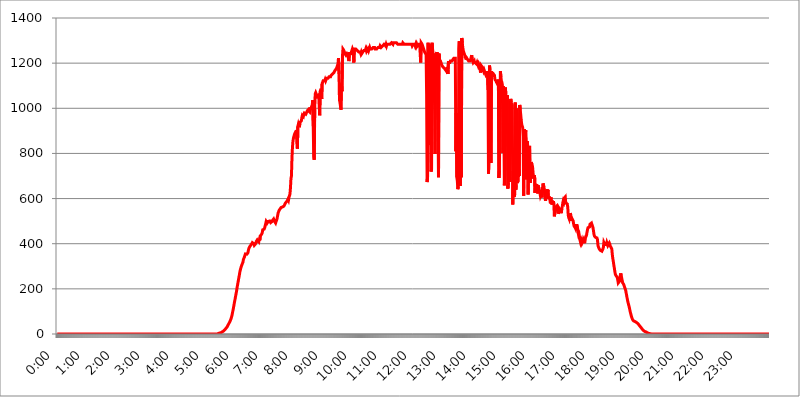
| Category | 2015.04.20. Intenzitás [W/m^2] |
|---|---|
| 0.0 | -0.256 |
| 0.0006944444444444445 | -0.256 |
| 0.001388888888888889 | -0.256 |
| 0.0020833333333333333 | -0.256 |
| 0.002777777777777778 | -0.256 |
| 0.003472222222222222 | -0.256 |
| 0.004166666666666667 | -0.256 |
| 0.004861111111111111 | -0.256 |
| 0.005555555555555556 | -0.256 |
| 0.0062499999999999995 | -0.256 |
| 0.006944444444444444 | -0.256 |
| 0.007638888888888889 | -0.256 |
| 0.008333333333333333 | -0.256 |
| 0.009027777777777779 | -0.256 |
| 0.009722222222222222 | -0.256 |
| 0.010416666666666666 | -0.256 |
| 0.011111111111111112 | -0.256 |
| 0.011805555555555555 | -0.256 |
| 0.012499999999999999 | -0.256 |
| 0.013194444444444444 | -0.256 |
| 0.013888888888888888 | -0.256 |
| 0.014583333333333332 | -0.256 |
| 0.015277777777777777 | -0.256 |
| 0.015972222222222224 | -0.256 |
| 0.016666666666666666 | -0.256 |
| 0.017361111111111112 | -0.256 |
| 0.018055555555555557 | -0.256 |
| 0.01875 | -0.256 |
| 0.019444444444444445 | -0.256 |
| 0.02013888888888889 | -0.256 |
| 0.020833333333333332 | -0.256 |
| 0.02152777777777778 | -0.256 |
| 0.022222222222222223 | -0.256 |
| 0.02291666666666667 | -0.256 |
| 0.02361111111111111 | -0.256 |
| 0.024305555555555556 | -0.256 |
| 0.024999999999999998 | -0.256 |
| 0.025694444444444447 | -0.256 |
| 0.02638888888888889 | -0.256 |
| 0.027083333333333334 | -0.256 |
| 0.027777777777777776 | -0.256 |
| 0.02847222222222222 | -0.256 |
| 0.029166666666666664 | -0.256 |
| 0.029861111111111113 | -0.256 |
| 0.030555555555555555 | -0.256 |
| 0.03125 | -0.256 |
| 0.03194444444444445 | -0.256 |
| 0.03263888888888889 | -0.256 |
| 0.03333333333333333 | -0.256 |
| 0.034027777777777775 | -0.256 |
| 0.034722222222222224 | -0.256 |
| 0.035416666666666666 | -0.256 |
| 0.036111111111111115 | -0.256 |
| 0.03680555555555556 | -0.256 |
| 0.0375 | -0.256 |
| 0.03819444444444444 | -0.256 |
| 0.03888888888888889 | -0.256 |
| 0.03958333333333333 | -0.256 |
| 0.04027777777777778 | -0.256 |
| 0.04097222222222222 | -0.256 |
| 0.041666666666666664 | -0.256 |
| 0.042361111111111106 | -0.256 |
| 0.04305555555555556 | -0.256 |
| 0.043750000000000004 | -0.256 |
| 0.044444444444444446 | -0.256 |
| 0.04513888888888889 | -0.256 |
| 0.04583333333333334 | -0.256 |
| 0.04652777777777778 | -0.256 |
| 0.04722222222222222 | -0.256 |
| 0.04791666666666666 | -0.256 |
| 0.04861111111111111 | -0.256 |
| 0.049305555555555554 | -0.256 |
| 0.049999999999999996 | -0.256 |
| 0.05069444444444445 | -0.256 |
| 0.051388888888888894 | -0.256 |
| 0.052083333333333336 | -0.256 |
| 0.05277777777777778 | -0.256 |
| 0.05347222222222222 | -0.256 |
| 0.05416666666666667 | -0.256 |
| 0.05486111111111111 | -0.256 |
| 0.05555555555555555 | -0.256 |
| 0.05625 | -0.256 |
| 0.05694444444444444 | -0.256 |
| 0.057638888888888885 | -0.256 |
| 0.05833333333333333 | -0.256 |
| 0.05902777777777778 | -0.256 |
| 0.059722222222222225 | -0.256 |
| 0.06041666666666667 | -0.256 |
| 0.061111111111111116 | -0.256 |
| 0.06180555555555556 | -0.256 |
| 0.0625 | -0.256 |
| 0.06319444444444444 | -0.256 |
| 0.06388888888888888 | -0.256 |
| 0.06458333333333334 | -0.256 |
| 0.06527777777777778 | -0.256 |
| 0.06597222222222222 | -0.256 |
| 0.06666666666666667 | -0.256 |
| 0.06736111111111111 | -0.256 |
| 0.06805555555555555 | -0.256 |
| 0.06874999999999999 | -0.256 |
| 0.06944444444444443 | -0.256 |
| 0.07013888888888889 | -0.256 |
| 0.07083333333333333 | -0.256 |
| 0.07152777777777779 | -0.256 |
| 0.07222222222222223 | -0.256 |
| 0.07291666666666667 | -0.256 |
| 0.07361111111111111 | -0.256 |
| 0.07430555555555556 | -0.256 |
| 0.075 | -0.256 |
| 0.07569444444444444 | -0.256 |
| 0.0763888888888889 | -0.256 |
| 0.07708333333333334 | -0.256 |
| 0.07777777777777778 | -0.256 |
| 0.07847222222222222 | -0.256 |
| 0.07916666666666666 | -0.256 |
| 0.0798611111111111 | -0.256 |
| 0.08055555555555556 | -0.256 |
| 0.08125 | -0.256 |
| 0.08194444444444444 | -0.256 |
| 0.08263888888888889 | -0.256 |
| 0.08333333333333333 | -0.256 |
| 0.08402777777777777 | -0.256 |
| 0.08472222222222221 | -0.256 |
| 0.08541666666666665 | -0.256 |
| 0.08611111111111112 | -0.256 |
| 0.08680555555555557 | -0.256 |
| 0.08750000000000001 | -0.256 |
| 0.08819444444444445 | -0.256 |
| 0.08888888888888889 | -0.256 |
| 0.08958333333333333 | -0.256 |
| 0.09027777777777778 | -0.256 |
| 0.09097222222222222 | -0.256 |
| 0.09166666666666667 | -0.256 |
| 0.09236111111111112 | -0.256 |
| 0.09305555555555556 | -0.256 |
| 0.09375 | -0.256 |
| 0.09444444444444444 | -0.256 |
| 0.09513888888888888 | -0.256 |
| 0.09583333333333333 | -0.256 |
| 0.09652777777777777 | -0.256 |
| 0.09722222222222222 | -0.256 |
| 0.09791666666666667 | -0.256 |
| 0.09861111111111111 | -0.256 |
| 0.09930555555555555 | -0.256 |
| 0.09999999999999999 | -0.256 |
| 0.10069444444444443 | -0.256 |
| 0.1013888888888889 | -0.256 |
| 0.10208333333333335 | -0.256 |
| 0.10277777777777779 | -0.256 |
| 0.10347222222222223 | -0.256 |
| 0.10416666666666667 | -0.256 |
| 0.10486111111111111 | -0.256 |
| 0.10555555555555556 | -0.256 |
| 0.10625 | -0.256 |
| 0.10694444444444444 | -0.256 |
| 0.1076388888888889 | -0.256 |
| 0.10833333333333334 | -0.256 |
| 0.10902777777777778 | -0.256 |
| 0.10972222222222222 | -0.256 |
| 0.1111111111111111 | -0.256 |
| 0.11180555555555556 | -0.256 |
| 0.11180555555555556 | -0.256 |
| 0.1125 | -0.256 |
| 0.11319444444444444 | -0.256 |
| 0.11388888888888889 | -0.256 |
| 0.11458333333333333 | -0.256 |
| 0.11527777777777777 | -0.256 |
| 0.11597222222222221 | -0.256 |
| 0.11666666666666665 | -0.256 |
| 0.1173611111111111 | -0.256 |
| 0.11805555555555557 | -0.256 |
| 0.11944444444444445 | -0.256 |
| 0.12013888888888889 | -0.256 |
| 0.12083333333333333 | -0.256 |
| 0.12152777777777778 | -0.256 |
| 0.12222222222222223 | -0.256 |
| 0.12291666666666667 | -0.256 |
| 0.12291666666666667 | -0.256 |
| 0.12361111111111112 | -0.256 |
| 0.12430555555555556 | -0.256 |
| 0.125 | -0.256 |
| 0.12569444444444444 | -0.256 |
| 0.12638888888888888 | -0.256 |
| 0.12708333333333333 | -0.256 |
| 0.16875 | -0.256 |
| 0.12847222222222224 | -0.256 |
| 0.12916666666666668 | -0.256 |
| 0.12986111111111112 | -0.256 |
| 0.13055555555555556 | -0.256 |
| 0.13125 | -0.256 |
| 0.13194444444444445 | -0.256 |
| 0.1326388888888889 | -0.256 |
| 0.13333333333333333 | -0.256 |
| 0.13402777777777777 | -0.256 |
| 0.13402777777777777 | -0.256 |
| 0.13472222222222222 | -0.256 |
| 0.13541666666666666 | -0.256 |
| 0.1361111111111111 | -0.256 |
| 0.13749999999999998 | -0.256 |
| 0.13819444444444443 | -0.256 |
| 0.1388888888888889 | -0.256 |
| 0.13958333333333334 | -0.256 |
| 0.14027777777777778 | -0.256 |
| 0.14097222222222222 | -0.256 |
| 0.14166666666666666 | -0.256 |
| 0.1423611111111111 | -0.256 |
| 0.14305555555555557 | -0.256 |
| 0.14375000000000002 | -0.256 |
| 0.14444444444444446 | -0.256 |
| 0.1451388888888889 | -0.256 |
| 0.1451388888888889 | -0.256 |
| 0.14652777777777778 | -0.256 |
| 0.14722222222222223 | -0.256 |
| 0.14791666666666667 | -0.256 |
| 0.1486111111111111 | -0.256 |
| 0.14930555555555555 | -0.256 |
| 0.15 | -0.256 |
| 0.15069444444444444 | -0.256 |
| 0.15138888888888888 | -0.256 |
| 0.15208333333333332 | -0.256 |
| 0.15277777777777776 | -0.256 |
| 0.15347222222222223 | -0.256 |
| 0.15416666666666667 | -0.256 |
| 0.15486111111111112 | -0.256 |
| 0.15555555555555556 | -0.256 |
| 0.15625 | -0.256 |
| 0.15694444444444444 | -0.256 |
| 0.15763888888888888 | -0.256 |
| 0.15833333333333333 | -0.256 |
| 0.15902777777777777 | -0.256 |
| 0.15972222222222224 | -0.256 |
| 0.16041666666666668 | -0.256 |
| 0.16111111111111112 | -0.256 |
| 0.16180555555555556 | -0.256 |
| 0.1625 | -0.256 |
| 0.16319444444444445 | -0.256 |
| 0.1638888888888889 | -0.256 |
| 0.16458333333333333 | -0.256 |
| 0.16527777777777777 | -0.256 |
| 0.16597222222222222 | -0.256 |
| 0.16666666666666666 | -0.256 |
| 0.1673611111111111 | -0.256 |
| 0.16805555555555554 | -0.256 |
| 0.16874999999999998 | -0.256 |
| 0.16944444444444443 | -0.256 |
| 0.17013888888888887 | -0.256 |
| 0.1708333333333333 | -0.256 |
| 0.17152777777777775 | -0.256 |
| 0.17222222222222225 | -0.256 |
| 0.1729166666666667 | -0.256 |
| 0.17361111111111113 | -0.256 |
| 0.17430555555555557 | -0.256 |
| 0.17500000000000002 | -0.256 |
| 0.17569444444444446 | -0.256 |
| 0.1763888888888889 | -0.256 |
| 0.17708333333333334 | -0.256 |
| 0.17777777777777778 | -0.256 |
| 0.17847222222222223 | -0.256 |
| 0.17916666666666667 | -0.256 |
| 0.1798611111111111 | -0.256 |
| 0.18055555555555555 | -0.256 |
| 0.18125 | -0.256 |
| 0.18194444444444444 | -0.256 |
| 0.1826388888888889 | -0.256 |
| 0.18333333333333335 | -0.256 |
| 0.1840277777777778 | -0.256 |
| 0.18472222222222223 | -0.256 |
| 0.18541666666666667 | -0.256 |
| 0.18611111111111112 | -0.256 |
| 0.18680555555555556 | -0.256 |
| 0.1875 | -0.256 |
| 0.18819444444444444 | -0.256 |
| 0.18888888888888888 | -0.256 |
| 0.18958333333333333 | -0.256 |
| 0.19027777777777777 | -0.256 |
| 0.1909722222222222 | -0.256 |
| 0.19166666666666665 | -0.256 |
| 0.19236111111111112 | -0.256 |
| 0.19305555555555554 | -0.256 |
| 0.19375 | -0.256 |
| 0.19444444444444445 | -0.256 |
| 0.1951388888888889 | -0.256 |
| 0.19583333333333333 | -0.256 |
| 0.19652777777777777 | -0.256 |
| 0.19722222222222222 | -0.256 |
| 0.19791666666666666 | -0.256 |
| 0.1986111111111111 | -0.256 |
| 0.19930555555555554 | -0.256 |
| 0.19999999999999998 | -0.256 |
| 0.20069444444444443 | -0.256 |
| 0.20138888888888887 | -0.256 |
| 0.2020833333333333 | -0.256 |
| 0.2027777777777778 | -0.256 |
| 0.2034722222222222 | -0.256 |
| 0.2041666666666667 | -0.256 |
| 0.20486111111111113 | -0.256 |
| 0.20555555555555557 | -0.256 |
| 0.20625000000000002 | -0.256 |
| 0.20694444444444446 | -0.256 |
| 0.2076388888888889 | -0.256 |
| 0.20833333333333334 | -0.256 |
| 0.20902777777777778 | -0.256 |
| 0.20972222222222223 | -0.256 |
| 0.21041666666666667 | -0.256 |
| 0.2111111111111111 | -0.256 |
| 0.21180555555555555 | -0.256 |
| 0.2125 | -0.256 |
| 0.21319444444444444 | -0.256 |
| 0.2138888888888889 | -0.256 |
| 0.21458333333333335 | -0.256 |
| 0.2152777777777778 | -0.256 |
| 0.21597222222222223 | -0.256 |
| 0.21666666666666667 | -0.256 |
| 0.21736111111111112 | -0.256 |
| 0.21805555555555556 | -0.256 |
| 0.21875 | -0.256 |
| 0.21944444444444444 | -0.256 |
| 0.22013888888888888 | -0.256 |
| 0.22083333333333333 | -0.256 |
| 0.22152777777777777 | -0.256 |
| 0.2222222222222222 | -0.256 |
| 0.22291666666666665 | -0.256 |
| 0.2236111111111111 | 1.09 |
| 0.22430555555555556 | 1.09 |
| 0.225 | 1.09 |
| 0.22569444444444445 | 2.439 |
| 0.2263888888888889 | 2.439 |
| 0.22708333333333333 | 3.791 |
| 0.22777777777777777 | 3.791 |
| 0.22847222222222222 | 5.146 |
| 0.22916666666666666 | 5.146 |
| 0.2298611111111111 | 6.503 |
| 0.23055555555555554 | 7.862 |
| 0.23124999999999998 | 9.225 |
| 0.23194444444444443 | 10.589 |
| 0.23263888888888887 | 11.956 |
| 0.2333333333333333 | 13.325 |
| 0.2340277777777778 | 16.069 |
| 0.2347222222222222 | 17.444 |
| 0.2354166666666667 | 20.201 |
| 0.23611111111111113 | 22.965 |
| 0.23680555555555557 | 25.736 |
| 0.23750000000000002 | 28.514 |
| 0.23819444444444446 | 31.297 |
| 0.2388888888888889 | 35.483 |
| 0.23958333333333334 | 39.68 |
| 0.24027777777777778 | 43.886 |
| 0.24097222222222223 | 48.1 |
| 0.24166666666666667 | 52.322 |
| 0.2423611111111111 | 56.548 |
| 0.24305555555555555 | 62.189 |
| 0.24375 | 67.835 |
| 0.24444444444444446 | 74.892 |
| 0.24513888888888888 | 83.356 |
| 0.24583333333333335 | 94.617 |
| 0.2465277777777778 | 105.834 |
| 0.24722222222222223 | 116.989 |
| 0.24791666666666667 | 129.444 |
| 0.24861111111111112 | 141.782 |
| 0.24930555555555556 | 152.637 |
| 0.25 | 164.712 |
| 0.25069444444444444 | 176.631 |
| 0.2513888888888889 | 188.389 |
| 0.2520833333333333 | 202.534 |
| 0.25277777777777777 | 215.177 |
| 0.2534722222222222 | 227.618 |
| 0.25416666666666665 | 239.868 |
| 0.2548611111111111 | 251.939 |
| 0.2555555555555556 | 263.851 |
| 0.25625000000000003 | 276.797 |
| 0.2569444444444445 | 286.13 |
| 0.2576388888888889 | 294.255 |
| 0.25833333333333336 | 301.198 |
| 0.2590277777777778 | 306.974 |
| 0.25972222222222224 | 312.749 |
| 0.2604166666666667 | 317.371 |
| 0.2611111111111111 | 330.117 |
| 0.26180555555555557 | 335.941 |
| 0.2625 | 340.62 |
| 0.26319444444444445 | 348.865 |
| 0.2638888888888889 | 354.805 |
| 0.26458333333333334 | 355.999 |
| 0.2652777777777778 | 357.196 |
| 0.2659722222222222 | 353.613 |
| 0.26666666666666666 | 351.235 |
| 0.2673611111111111 | 359.595 |
| 0.26805555555555555 | 370.515 |
| 0.26875 | 379.171 |
| 0.26944444444444443 | 382.93 |
| 0.2701388888888889 | 387.995 |
| 0.2708333333333333 | 391.834 |
| 0.27152777777777776 | 390.55 |
| 0.2722222222222222 | 397.012 |
| 0.27291666666666664 | 400.943 |
| 0.2736111111111111 | 404.916 |
| 0.2743055555555555 | 407.589 |
| 0.27499999999999997 | 406.25 |
| 0.27569444444444446 | 399.628 |
| 0.27638888888888885 | 393.122 |
| 0.27708333333333335 | 391.834 |
| 0.2777777777777778 | 397.012 |
| 0.27847222222222223 | 400.943 |
| 0.2791666666666667 | 410.283 |
| 0.2798611111111111 | 411.638 |
| 0.28055555555555556 | 417.112 |
| 0.28125 | 418.495 |
| 0.28194444444444444 | 418.495 |
| 0.2826388888888889 | 408.934 |
| 0.2833333333333333 | 422.678 |
| 0.28402777777777777 | 414.364 |
| 0.2847222222222222 | 434.107 |
| 0.28541666666666665 | 435.566 |
| 0.28611111111111115 | 435.566 |
| 0.28680555555555554 | 442.962 |
| 0.28750000000000003 | 449.011 |
| 0.2881944444444445 | 461.486 |
| 0.2888888888888889 | 463.083 |
| 0.28958333333333336 | 463.083 |
| 0.2902777777777778 | 464.688 |
| 0.29097222222222224 | 471.198 |
| 0.2916666666666667 | 479.541 |
| 0.2923611111111111 | 482.945 |
| 0.29305555555555557 | 498.764 |
| 0.29375 | 502.396 |
| 0.29444444444444445 | 491.63 |
| 0.2951388888888889 | 489.873 |
| 0.29583333333333334 | 498.764 |
| 0.2965277777777778 | 496.965 |
| 0.2972222222222222 | 500.575 |
| 0.29791666666666666 | 500.575 |
| 0.2986111111111111 | 498.764 |
| 0.29930555555555555 | 493.398 |
| 0.3 | 495.176 |
| 0.30069444444444443 | 491.63 |
| 0.3013888888888889 | 498.764 |
| 0.3020833333333333 | 504.229 |
| 0.30277777777777776 | 504.229 |
| 0.3034722222222222 | 509.793 |
| 0.30416666666666664 | 506.072 |
| 0.3048611111111111 | 498.764 |
| 0.3055555555555555 | 496.965 |
| 0.30624999999999997 | 491.63 |
| 0.3069444444444444 | 498.764 |
| 0.3076388888888889 | 504.229 |
| 0.30833333333333335 | 511.671 |
| 0.3090277777777778 | 523.186 |
| 0.30972222222222223 | 535.145 |
| 0.3104166666666667 | 539.234 |
| 0.3111111111111111 | 547.572 |
| 0.31180555555555556 | 549.691 |
| 0.3125 | 553.97 |
| 0.31319444444444444 | 558.305 |
| 0.3138888888888889 | 560.495 |
| 0.3145833333333333 | 562.699 |
| 0.31527777777777777 | 560.495 |
| 0.3159722222222222 | 562.699 |
| 0.31666666666666665 | 564.917 |
| 0.31736111111111115 | 564.917 |
| 0.31805555555555554 | 567.15 |
| 0.31875000000000003 | 571.661 |
| 0.3194444444444445 | 576.233 |
| 0.3201388888888889 | 580.866 |
| 0.32083333333333336 | 583.206 |
| 0.3215277777777778 | 585.562 |
| 0.32222222222222224 | 587.934 |
| 0.3229166666666667 | 592.725 |
| 0.3236111111111111 | 597.582 |
| 0.32430555555555557 | 592.725 |
| 0.325 | 604.992 |
| 0.32569444444444445 | 612.554 |
| 0.3263888888888889 | 620.273 |
| 0.32708333333333334 | 647.179 |
| 0.3277777777777778 | 688.102 |
| 0.3284722222222222 | 700.54 |
| 0.32916666666666666 | 775.451 |
| 0.3298611111111111 | 825.351 |
| 0.33055555555555555 | 854.113 |
| 0.33125 | 866.865 |
| 0.33194444444444443 | 875.511 |
| 0.3326388888888889 | 884.274 |
| 0.3333333333333333 | 888.701 |
| 0.3340277777777778 | 893.157 |
| 0.3347222222222222 | 897.643 |
| 0.3354166666666667 | 902.16 |
| 0.3361111111111111 | 902.16 |
| 0.3368055555555556 | 821.353 |
| 0.33749999999999997 | 920.533 |
| 0.33819444444444446 | 929.905 |
| 0.33888888888888885 | 929.905 |
| 0.33958333333333335 | 915.893 |
| 0.34027777777777773 | 934.639 |
| 0.34097222222222223 | 939.404 |
| 0.3416666666666666 | 939.404 |
| 0.3423611111111111 | 944.201 |
| 0.3430555555555555 | 958.785 |
| 0.34375 | 968.671 |
| 0.3444444444444445 | 968.671 |
| 0.3451388888888889 | 963.712 |
| 0.3458333333333334 | 973.663 |
| 0.34652777777777777 | 978.688 |
| 0.34722222222222227 | 978.688 |
| 0.34791666666666665 | 978.688 |
| 0.34861111111111115 | 973.663 |
| 0.34930555555555554 | 978.688 |
| 0.35000000000000003 | 983.747 |
| 0.3506944444444444 | 988.839 |
| 0.3513888888888889 | 988.839 |
| 0.3520833333333333 | 993.965 |
| 0.3527777777777778 | 988.839 |
| 0.3534722222222222 | 988.839 |
| 0.3541666666666667 | 983.747 |
| 0.3548611111111111 | 993.965 |
| 0.35555555555555557 | 1004.318 |
| 0.35625 | 993.965 |
| 0.35694444444444445 | 1009.546 |
| 0.3576388888888889 | 1014.809 |
| 0.35833333333333334 | 1036.206 |
| 0.3590277777777778 | 920.533 |
| 0.3597222222222222 | 786.575 |
| 0.36041666666666666 | 771.794 |
| 0.3611111111111111 | 999.125 |
| 0.36180555555555555 | 1063.751 |
| 0.3625 | 1069.368 |
| 0.36319444444444443 | 1063.751 |
| 0.3638888888888889 | 1058.17 |
| 0.3645833333333333 | 1052.625 |
| 0.3652777777777778 | 1052.625 |
| 0.3659722222222222 | 1052.625 |
| 0.3666666666666667 | 1058.17 |
| 0.3673611111111111 | 1058.17 |
| 0.3680555555555556 | 968.671 |
| 0.36874999999999997 | 1075.021 |
| 0.36944444444444446 | 1080.711 |
| 0.37013888888888885 | 1086.439 |
| 0.37083333333333335 | 1041.644 |
| 0.37152777777777773 | 1109.72 |
| 0.37222222222222223 | 1115.634 |
| 0.3729166666666666 | 1121.587 |
| 0.3736111111111111 | 1121.587 |
| 0.3743055555555555 | 1121.587 |
| 0.375 | 1121.587 |
| 0.3756944444444445 | 1127.578 |
| 0.3763888888888889 | 1121.587 |
| 0.3770833333333334 | 1121.587 |
| 0.37777777777777777 | 1133.607 |
| 0.37847222222222227 | 1133.607 |
| 0.37916666666666665 | 1133.607 |
| 0.37986111111111115 | 1133.607 |
| 0.38055555555555554 | 1133.607 |
| 0.38125000000000003 | 1139.675 |
| 0.3819444444444444 | 1139.675 |
| 0.3826388888888889 | 1139.675 |
| 0.3833333333333333 | 1139.675 |
| 0.3840277777777778 | 1145.782 |
| 0.3847222222222222 | 1145.782 |
| 0.3854166666666667 | 1145.782 |
| 0.3861111111111111 | 1151.928 |
| 0.38680555555555557 | 1151.928 |
| 0.3875 | 1151.928 |
| 0.38819444444444445 | 1158.113 |
| 0.3888888888888889 | 1164.337 |
| 0.38958333333333334 | 1164.337 |
| 0.3902777777777778 | 1170.601 |
| 0.3909722222222222 | 1170.601 |
| 0.39166666666666666 | 1176.905 |
| 0.3923611111111111 | 1176.905 |
| 0.39305555555555555 | 1189.633 |
| 0.39375 | 1196.058 |
| 0.39444444444444443 | 1222.164 |
| 0.3951388888888889 | 1151.928 |
| 0.3958333333333333 | 1036.206 |
| 0.3965277777777778 | 1025.437 |
| 0.3972222222222222 | 1009.546 |
| 0.3979166666666667 | 993.965 |
| 0.3986111111111111 | 1109.72 |
| 0.3993055555555556 | 1075.021 |
| 0.39999999999999997 | 1228.794 |
| 0.40069444444444446 | 1262.571 |
| 0.40138888888888885 | 1262.571 |
| 0.40208333333333335 | 1255.731 |
| 0.40277777777777773 | 1248.934 |
| 0.40347222222222223 | 1242.179 |
| 0.4041666666666666 | 1242.179 |
| 0.4048611111111111 | 1235.465 |
| 0.4055555555555555 | 1235.465 |
| 0.40625 | 1242.179 |
| 0.4069444444444445 | 1242.179 |
| 0.4076388888888889 | 1235.465 |
| 0.4083333333333334 | 1235.465 |
| 0.40902777777777777 | 1209.029 |
| 0.40972222222222227 | 1242.179 |
| 0.41041666666666665 | 1242.179 |
| 0.41111111111111115 | 1242.179 |
| 0.41180555555555554 | 1242.179 |
| 0.41250000000000003 | 1248.934 |
| 0.4131944444444444 | 1248.934 |
| 0.4138888888888889 | 1262.571 |
| 0.4145833333333333 | 1255.731 |
| 0.4152777777777778 | 1235.465 |
| 0.4159722222222222 | 1202.523 |
| 0.4166666666666667 | 1262.571 |
| 0.4173611111111111 | 1262.571 |
| 0.41805555555555557 | 1262.571 |
| 0.41875 | 1262.571 |
| 0.41944444444444445 | 1262.571 |
| 0.4201388888888889 | 1262.571 |
| 0.42083333333333334 | 1255.731 |
| 0.4215277777777778 | 1255.731 |
| 0.4222222222222222 | 1255.731 |
| 0.42291666666666666 | 1248.934 |
| 0.4236111111111111 | 1248.934 |
| 0.42430555555555555 | 1248.934 |
| 0.425 | 1248.934 |
| 0.42569444444444443 | 1242.179 |
| 0.4263888888888889 | 1248.934 |
| 0.4270833333333333 | 1242.179 |
| 0.4277777777777778 | 1242.179 |
| 0.4284722222222222 | 1248.934 |
| 0.4291666666666667 | 1248.934 |
| 0.4298611111111111 | 1255.731 |
| 0.4305555555555556 | 1255.731 |
| 0.43124999999999997 | 1255.731 |
| 0.43194444444444446 | 1255.731 |
| 0.43263888888888885 | 1262.571 |
| 0.43333333333333335 | 1255.731 |
| 0.43402777777777773 | 1262.571 |
| 0.43472222222222223 | 1255.731 |
| 0.4354166666666666 | 1255.731 |
| 0.4361111111111111 | 1262.571 |
| 0.4368055555555555 | 1255.731 |
| 0.4375 | 1262.571 |
| 0.4381944444444445 | 1269.454 |
| 0.4388888888888889 | 1262.571 |
| 0.4395833333333334 | 1262.571 |
| 0.44027777777777777 | 1262.571 |
| 0.44097222222222227 | 1262.571 |
| 0.44166666666666665 | 1262.571 |
| 0.44236111111111115 | 1262.571 |
| 0.44305555555555554 | 1269.454 |
| 0.44375000000000003 | 1269.454 |
| 0.4444444444444444 | 1269.454 |
| 0.4451388888888889 | 1269.454 |
| 0.4458333333333333 | 1262.571 |
| 0.4465277777777778 | 1262.571 |
| 0.4472222222222222 | 1262.571 |
| 0.4479166666666667 | 1262.571 |
| 0.4486111111111111 | 1262.571 |
| 0.44930555555555557 | 1262.571 |
| 0.45 | 1269.454 |
| 0.45069444444444445 | 1269.454 |
| 0.4513888888888889 | 1269.454 |
| 0.45208333333333334 | 1269.454 |
| 0.4527777777777778 | 1276.38 |
| 0.4534722222222222 | 1276.38 |
| 0.45416666666666666 | 1269.454 |
| 0.4548611111111111 | 1269.454 |
| 0.45555555555555555 | 1269.454 |
| 0.45625 | 1276.38 |
| 0.45694444444444443 | 1276.38 |
| 0.4576388888888889 | 1276.38 |
| 0.4583333333333333 | 1283.348 |
| 0.4590277777777778 | 1283.348 |
| 0.4597222222222222 | 1283.348 |
| 0.4604166666666667 | 1276.38 |
| 0.4611111111111111 | 1283.348 |
| 0.4618055555555556 | 1276.38 |
| 0.46249999999999997 | 1283.348 |
| 0.46319444444444446 | 1283.348 |
| 0.46388888888888885 | 1283.348 |
| 0.46458333333333335 | 1283.348 |
| 0.46527777777777773 | 1283.348 |
| 0.46597222222222223 | 1283.348 |
| 0.4666666666666666 | 1283.348 |
| 0.4673611111111111 | 1283.348 |
| 0.4680555555555555 | 1283.348 |
| 0.46875 | 1290.36 |
| 0.4694444444444445 | 1290.36 |
| 0.4701388888888889 | 1290.36 |
| 0.4708333333333334 | 1283.348 |
| 0.47152777777777777 | 1290.36 |
| 0.47222222222222227 | 1290.36 |
| 0.47291666666666665 | 1290.36 |
| 0.47361111111111115 | 1290.36 |
| 0.47430555555555554 | 1290.36 |
| 0.47500000000000003 | 1290.36 |
| 0.4756944444444444 | 1290.36 |
| 0.4763888888888889 | 1290.36 |
| 0.4770833333333333 | 1290.36 |
| 0.4777777777777778 | 1283.348 |
| 0.4784722222222222 | 1283.348 |
| 0.4791666666666667 | 1283.348 |
| 0.4798611111111111 | 1283.348 |
| 0.48055555555555557 | 1283.348 |
| 0.48125 | 1283.348 |
| 0.48194444444444445 | 1283.348 |
| 0.4826388888888889 | 1283.348 |
| 0.48333333333333334 | 1283.348 |
| 0.4840277777777778 | 1283.348 |
| 0.4847222222222222 | 1290.36 |
| 0.48541666666666666 | 1290.36 |
| 0.4861111111111111 | 1290.36 |
| 0.48680555555555555 | 1283.348 |
| 0.4875 | 1283.348 |
| 0.48819444444444443 | 1283.348 |
| 0.4888888888888889 | 1283.348 |
| 0.4895833333333333 | 1283.348 |
| 0.4902777777777778 | 1283.348 |
| 0.4909722222222222 | 1283.348 |
| 0.4916666666666667 | 1283.348 |
| 0.4923611111111111 | 1283.348 |
| 0.4930555555555556 | 1283.348 |
| 0.49374999999999997 | 1283.348 |
| 0.49444444444444446 | 1283.348 |
| 0.49513888888888885 | 1283.348 |
| 0.49583333333333335 | 1283.348 |
| 0.49652777777777773 | 1283.348 |
| 0.49722222222222223 | 1283.348 |
| 0.4979166666666666 | 1276.38 |
| 0.4986111111111111 | 1276.38 |
| 0.4993055555555555 | 1283.348 |
| 0.5 | 1283.348 |
| 0.5006944444444444 | 1283.348 |
| 0.5013888888888889 | 1283.348 |
| 0.5020833333333333 | 1276.38 |
| 0.5027777777777778 | 1283.348 |
| 0.5034722222222222 | 1276.38 |
| 0.5041666666666667 | 1283.348 |
| 0.5048611111111111 | 1276.38 |
| 0.5055555555555555 | 1276.38 |
| 0.50625 | 1283.348 |
| 0.5069444444444444 | 1283.348 |
| 0.5076388888888889 | 1283.348 |
| 0.5083333333333333 | 1283.348 |
| 0.5090277777777777 | 1283.348 |
| 0.5097222222222222 | 1202.523 |
| 0.5104166666666666 | 1290.36 |
| 0.5111111111111112 | 1290.36 |
| 0.5118055555555555 | 1283.348 |
| 0.5125000000000001 | 1276.38 |
| 0.5131944444444444 | 1269.454 |
| 0.513888888888889 | 1262.571 |
| 0.5145833333333333 | 1255.731 |
| 0.5152777777777778 | 1248.934 |
| 0.5159722222222222 | 1248.934 |
| 0.5166666666666667 | 1242.179 |
| 0.517361111111111 | 1235.465 |
| 0.5180555555555556 | 1063.751 |
| 0.5187499999999999 | 673.03 |
| 0.5194444444444445 | 697.399 |
| 0.5201388888888888 | 1290.36 |
| 0.5208333333333334 | 837.51 |
| 0.5215277777777778 | 1283.348 |
| 0.5222222222222223 | 1262.571 |
| 0.5229166666666667 | 1248.934 |
| 0.5236111111111111 | 1276.38 |
| 0.5243055555555556 | 719.855 |
| 0.525 | 729.817 |
| 0.5256944444444445 | 1290.36 |
| 0.5263888888888889 | 1262.571 |
| 0.5270833333333333 | 1242.179 |
| 0.5277777777777778 | 1235.465 |
| 0.5284722222222222 | 1228.794 |
| 0.5291666666666667 | 1014.809 |
| 0.5298611111111111 | 797.931 |
| 0.5305555555555556 | 1242.179 |
| 0.53125 | 1228.794 |
| 0.5319444444444444 | 1228.794 |
| 0.5326388888888889 | 1248.934 |
| 0.5333333333333333 | 1248.934 |
| 0.5340277777777778 | 949.03 |
| 0.5347222222222222 | 694.278 |
| 0.5354166666666667 | 1242.179 |
| 0.5361111111111111 | 1215.576 |
| 0.5368055555555555 | 1215.576 |
| 0.5375 | 1209.029 |
| 0.5381944444444444 | 1202.523 |
| 0.5388888888888889 | 1196.058 |
| 0.5395833333333333 | 1189.633 |
| 0.5402777777777777 | 1189.633 |
| 0.5409722222222222 | 1183.249 |
| 0.5416666666666666 | 1183.249 |
| 0.5423611111111112 | 1183.249 |
| 0.5430555555555555 | 1176.905 |
| 0.5437500000000001 | 1176.905 |
| 0.5444444444444444 | 1170.601 |
| 0.545138888888889 | 1170.601 |
| 0.5458333333333333 | 1164.337 |
| 0.5465277777777778 | 1170.601 |
| 0.5472222222222222 | 1183.249 |
| 0.5479166666666667 | 1151.928 |
| 0.548611111111111 | 1202.523 |
| 0.5493055555555556 | 1202.523 |
| 0.5499999999999999 | 1202.523 |
| 0.5506944444444445 | 1202.523 |
| 0.5513888888888888 | 1209.029 |
| 0.5520833333333334 | 1209.029 |
| 0.5527777777777778 | 1209.029 |
| 0.5534722222222223 | 1209.029 |
| 0.5541666666666667 | 1209.029 |
| 0.5548611111111111 | 1215.576 |
| 0.5555555555555556 | 1215.576 |
| 0.55625 | 1222.164 |
| 0.5569444444444445 | 1222.164 |
| 0.5576388888888889 | 1222.164 |
| 0.5583333333333333 | 1222.164 |
| 0.5590277777777778 | 809.522 |
| 0.5597222222222222 | 978.688 |
| 0.5604166666666667 | 694.278 |
| 0.5611111111111111 | 678.997 |
| 0.5618055555555556 | 641.649 |
| 0.5625 | 652.786 |
| 0.5631944444444444 | 1262.571 |
| 0.5638888888888889 | 1297.416 |
| 0.5645833333333333 | 743.425 |
| 0.5652777777777778 | 655.618 |
| 0.5659722222222222 | 794.119 |
| 0.5666666666666667 | 694.278 |
| 0.5673611111111111 | 1311.658 |
| 0.5680555555555555 | 1290.36 |
| 0.56875 | 1269.454 |
| 0.5694444444444444 | 1255.731 |
| 0.5701388888888889 | 1248.934 |
| 0.5708333333333333 | 1242.179 |
| 0.5715277777777777 | 1235.465 |
| 0.5722222222222222 | 1222.164 |
| 0.5729166666666666 | 1228.794 |
| 0.5736111111111112 | 1215.576 |
| 0.5743055555555555 | 1222.164 |
| 0.5750000000000001 | 1222.164 |
| 0.5756944444444444 | 1215.576 |
| 0.576388888888889 | 1215.576 |
| 0.5770833333333333 | 1209.029 |
| 0.5777777777777778 | 1209.029 |
| 0.5784722222222222 | 1209.029 |
| 0.5791666666666667 | 1209.029 |
| 0.579861111111111 | 1209.029 |
| 0.5805555555555556 | 1209.029 |
| 0.5812499999999999 | 1235.465 |
| 0.5819444444444445 | 1215.576 |
| 0.5826388888888888 | 1209.029 |
| 0.5833333333333334 | 1202.523 |
| 0.5840277777777778 | 1202.523 |
| 0.5847222222222223 | 1209.029 |
| 0.5854166666666667 | 1196.058 |
| 0.5861111111111111 | 1202.523 |
| 0.5868055555555556 | 1202.523 |
| 0.5875 | 1202.523 |
| 0.5881944444444445 | 1196.058 |
| 0.5888888888888889 | 1202.523 |
| 0.5895833333333333 | 1196.058 |
| 0.5902777777777778 | 1189.633 |
| 0.5909722222222222 | 1196.058 |
| 0.5916666666666667 | 1189.633 |
| 0.5923611111111111 | 1189.633 |
| 0.5930555555555556 | 1170.601 |
| 0.59375 | 1158.113 |
| 0.5944444444444444 | 1189.633 |
| 0.5951388888888889 | 1189.633 |
| 0.5958333333333333 | 1183.249 |
| 0.5965277777777778 | 1176.905 |
| 0.5972222222222222 | 1170.601 |
| 0.5979166666666667 | 1164.337 |
| 0.5986111111111111 | 1170.601 |
| 0.5993055555555555 | 1164.337 |
| 0.6 | 1164.337 |
| 0.6006944444444444 | 1151.928 |
| 0.6013888888888889 | 1158.113 |
| 0.6020833333333333 | 1164.337 |
| 0.6027777777777777 | 1151.928 |
| 0.6034722222222222 | 1158.113 |
| 0.6041666666666666 | 1080.711 |
| 0.6048611111111112 | 710.098 |
| 0.6055555555555555 | 786.575 |
| 0.6062500000000001 | 1189.633 |
| 0.6069444444444444 | 1170.601 |
| 0.607638888888889 | 1170.601 |
| 0.6083333333333333 | 757.414 |
| 0.6090277777777778 | 1164.337 |
| 0.6097222222222222 | 1151.928 |
| 0.6104166666666667 | 1145.782 |
| 0.611111111111111 | 1145.782 |
| 0.6118055555555556 | 1151.928 |
| 0.6124999999999999 | 1151.928 |
| 0.6131944444444445 | 1145.782 |
| 0.6138888888888888 | 1127.578 |
| 0.6145833333333334 | 1127.578 |
| 0.6152777777777778 | 1121.587 |
| 0.6159722222222223 | 1115.634 |
| 0.6166666666666667 | 1115.634 |
| 0.6173611111111111 | 1115.634 |
| 0.6180555555555556 | 1103.843 |
| 0.61875 | 1127.578 |
| 0.6194444444444445 | 691.18 |
| 0.6201388888888889 | 723.153 |
| 0.6208333333333333 | 988.839 |
| 0.6215277777777778 | 1164.337 |
| 0.6222222222222222 | 1139.675 |
| 0.6229166666666667 | 1121.587 |
| 0.6236111111111111 | 1115.634 |
| 0.6243055555555556 | 1103.843 |
| 0.625 | 801.768 |
| 0.6256944444444444 | 1098.004 |
| 0.6263888888888889 | 953.892 |
| 0.6270833333333333 | 658.471 |
| 0.6277777777777778 | 733.184 |
| 0.6284722222222222 | 1092.203 |
| 0.6291666666666667 | 1063.751 |
| 0.6298611111111111 | 1063.751 |
| 0.6305555555555555 | 911.285 |
| 0.63125 | 1058.17 |
| 0.6319444444444444 | 644.405 |
| 0.6326388888888889 | 670.078 |
| 0.6333333333333333 | 670.078 |
| 0.6340277777777777 | 743.425 |
| 0.6347222222222222 | 673.03 |
| 0.6354166666666666 | 1025.437 |
| 0.6361111111111112 | 1041.644 |
| 0.6368055555555555 | 1025.437 |
| 0.6375000000000001 | 1020.106 |
| 0.6381944444444444 | 1014.809 |
| 0.638888888888889 | 573.939 |
| 0.6395833333333333 | 723.153 |
| 0.6402777777777778 | 615.11 |
| 0.6409722222222222 | 607.495 |
| 0.6416666666666667 | 620.273 |
| 0.642361111111111 | 1025.437 |
| 0.6430555555555556 | 638.912 |
| 0.6437499999999999 | 658.471 |
| 0.6444444444444445 | 999.125 |
| 0.6451388888888888 | 670.078 |
| 0.6458333333333334 | 673.03 |
| 0.6465277777777778 | 678.997 |
| 0.6472222222222223 | 729.817 |
| 0.6479166666666667 | 700.54 |
| 0.6486111111111111 | 1014.809 |
| 0.6493055555555556 | 993.965 |
| 0.65 | 973.663 |
| 0.6506944444444445 | 949.03 |
| 0.6513888888888889 | 929.905 |
| 0.6520833333333333 | 920.533 |
| 0.6527777777777778 | 915.893 |
| 0.6534722222222222 | 875.511 |
| 0.6541666666666667 | 612.554 |
| 0.6548611111111111 | 906.707 |
| 0.6555555555555556 | 897.643 |
| 0.65625 | 779.134 |
| 0.6569444444444444 | 902.16 |
| 0.6576388888888889 | 833.43 |
| 0.6583333333333333 | 685.046 |
| 0.6590277777777778 | 854.113 |
| 0.6597222222222222 | 837.51 |
| 0.6604166666666667 | 617.682 |
| 0.6611111111111111 | 829.377 |
| 0.6618055555555555 | 801.768 |
| 0.6625 | 833.43 |
| 0.6631944444444444 | 670.078 |
| 0.6638888888888889 | 685.046 |
| 0.6645833333333333 | 760.972 |
| 0.6652777777777777 | 760.972 |
| 0.6659722222222222 | 750.371 |
| 0.6666666666666666 | 739.988 |
| 0.6673611111111111 | 713.328 |
| 0.6680555555555556 | 688.102 |
| 0.6687500000000001 | 688.102 |
| 0.6694444444444444 | 703.704 |
| 0.6701388888888888 | 625.508 |
| 0.6708333333333334 | 661.343 |
| 0.6715277777777778 | 661.343 |
| 0.6722222222222222 | 661.343 |
| 0.6729166666666666 | 658.471 |
| 0.6736111111111112 | 622.881 |
| 0.6743055555555556 | 658.471 |
| 0.6749999999999999 | 655.618 |
| 0.6756944444444444 | 644.405 |
| 0.6763888888888889 | 636.194 |
| 0.6770833333333334 | 636.194 |
| 0.6777777777777777 | 610.016 |
| 0.6784722222222223 | 615.11 |
| 0.6791666666666667 | 620.273 |
| 0.6798611111111111 | 604.992 |
| 0.6805555555555555 | 644.405 |
| 0.68125 | 667.146 |
| 0.6819444444444445 | 661.343 |
| 0.6826388888888889 | 652.786 |
| 0.6833333333333332 | 633.495 |
| 0.6840277777777778 | 604.992 |
| 0.6847222222222222 | 590.321 |
| 0.6854166666666667 | 600.035 |
| 0.686111111111111 | 620.273 |
| 0.6868055555555556 | 641.649 |
| 0.6875 | 617.682 |
| 0.6881944444444444 | 638.912 |
| 0.688888888888889 | 600.035 |
| 0.6895833333333333 | 610.016 |
| 0.6902777777777778 | 600.035 |
| 0.6909722222222222 | 595.145 |
| 0.6916666666666668 | 578.542 |
| 0.6923611111111111 | 604.992 |
| 0.6930555555555555 | 580.866 |
| 0.69375 | 573.939 |
| 0.6944444444444445 | 590.321 |
| 0.6951388888888889 | 573.939 |
| 0.6958333333333333 | 587.934 |
| 0.6965277777777777 | 576.233 |
| 0.6972222222222223 | 521.237 |
| 0.6979166666666666 | 521.237 |
| 0.6986111111111111 | 549.691 |
| 0.6993055555555556 | 562.699 |
| 0.7000000000000001 | 564.917 |
| 0.7006944444444444 | 560.495 |
| 0.7013888888888888 | 569.398 |
| 0.7020833333333334 | 564.917 |
| 0.7027777777777778 | 533.12 |
| 0.7034722222222222 | 539.234 |
| 0.7041666666666666 | 556.131 |
| 0.7048611111111112 | 558.305 |
| 0.7055555555555556 | 558.305 |
| 0.7062499999999999 | 547.572 |
| 0.7069444444444444 | 535.145 |
| 0.7076388888888889 | 556.131 |
| 0.7083333333333334 | 564.917 |
| 0.7090277777777777 | 580.866 |
| 0.7097222222222223 | 590.321 |
| 0.7104166666666667 | 585.562 |
| 0.7111111111111111 | 602.505 |
| 0.7118055555555555 | 602.505 |
| 0.7125 | 607.495 |
| 0.7131944444444445 | 580.866 |
| 0.7138888888888889 | 580.866 |
| 0.7145833333333332 | 578.542 |
| 0.7152777777777778 | 576.233 |
| 0.7159722222222222 | 562.699 |
| 0.7166666666666667 | 527.122 |
| 0.717361111111111 | 515.462 |
| 0.7180555555555556 | 509.793 |
| 0.71875 | 511.671 |
| 0.7194444444444444 | 535.145 |
| 0.720138888888889 | 529.108 |
| 0.7208333333333333 | 500.575 |
| 0.7215277777777778 | 513.561 |
| 0.7222222222222222 | 517.375 |
| 0.7229166666666668 | 511.671 |
| 0.7236111111111111 | 500.575 |
| 0.7243055555555555 | 486.389 |
| 0.725 | 477.854 |
| 0.7256944444444445 | 477.854 |
| 0.7263888888888889 | 471.198 |
| 0.7270833333333333 | 466.302 |
| 0.7277777777777777 | 466.302 |
| 0.7284722222222223 | 486.389 |
| 0.7291666666666666 | 489.873 |
| 0.7298611111111111 | 466.302 |
| 0.7305555555555556 | 447.487 |
| 0.7312500000000001 | 437.031 |
| 0.7319444444444444 | 441.469 |
| 0.7326388888888888 | 442.962 |
| 0.7333333333333334 | 414.364 |
| 0.7340277777777778 | 404.916 |
| 0.7347222222222222 | 411.638 |
| 0.7354166666666666 | 417.112 |
| 0.7361111111111112 | 403.587 |
| 0.7368055555555556 | 406.25 |
| 0.7374999999999999 | 404.916 |
| 0.7381944444444444 | 418.495 |
| 0.7388888888888889 | 407.589 |
| 0.7395833333333334 | 402.262 |
| 0.7402777777777777 | 421.278 |
| 0.7409722222222223 | 426.916 |
| 0.7416666666666667 | 428.341 |
| 0.7423611111111111 | 438.503 |
| 0.7430555555555555 | 452.082 |
| 0.74375 | 463.083 |
| 0.7444444444444445 | 471.198 |
| 0.7451388888888889 | 471.198 |
| 0.7458333333333332 | 469.557 |
| 0.7465277777777778 | 474.507 |
| 0.7472222222222222 | 486.389 |
| 0.7479166666666667 | 486.389 |
| 0.748611111111111 | 486.389 |
| 0.7493055555555556 | 491.63 |
| 0.75 | 495.176 |
| 0.7506944444444444 | 493.398 |
| 0.751388888888889 | 471.198 |
| 0.7520833333333333 | 456.747 |
| 0.7527777777777778 | 441.469 |
| 0.7534722222222222 | 434.107 |
| 0.7541666666666668 | 431.211 |
| 0.7548611111111111 | 428.341 |
| 0.7555555555555555 | 428.341 |
| 0.75625 | 429.773 |
| 0.7569444444444445 | 425.497 |
| 0.7576388888888889 | 418.495 |
| 0.7583333333333333 | 393.122 |
| 0.7590277777777777 | 385.455 |
| 0.7597222222222223 | 380.42 |
| 0.7604166666666666 | 375.442 |
| 0.7611111111111111 | 372.972 |
| 0.7618055555555556 | 370.515 |
| 0.7625000000000001 | 372.972 |
| 0.7631944444444444 | 371.742 |
| 0.7638888888888888 | 366.851 |
| 0.7645833333333334 | 369.291 |
| 0.7652777777777778 | 376.682 |
| 0.7659722222222222 | 384.191 |
| 0.7666666666666666 | 406.25 |
| 0.7673611111111112 | 403.587 |
| 0.7680555555555556 | 397.012 |
| 0.7687499999999999 | 398.318 |
| 0.7694444444444444 | 398.318 |
| 0.7701388888888889 | 395.711 |
| 0.7708333333333334 | 404.916 |
| 0.7715277777777777 | 407.589 |
| 0.7722222222222223 | 391.834 |
| 0.7729166666666667 | 391.834 |
| 0.7736111111111111 | 391.834 |
| 0.7743055555555555 | 403.587 |
| 0.775 | 398.318 |
| 0.7756944444444445 | 389.27 |
| 0.7763888888888889 | 385.455 |
| 0.7770833333333332 | 386.723 |
| 0.7777777777777778 | 376.682 |
| 0.7784722222222222 | 352.423 |
| 0.7791666666666667 | 334.774 |
| 0.779861111111111 | 321.998 |
| 0.7805555555555556 | 306.974 |
| 0.78125 | 293.096 |
| 0.7819444444444444 | 279.136 |
| 0.782638888888889 | 266.216 |
| 0.7833333333333333 | 260.293 |
| 0.7840277777777778 | 256.722 |
| 0.7847222222222222 | 256.722 |
| 0.7854166666666668 | 250.739 |
| 0.7861111111111111 | 239.868 |
| 0.7868055555555555 | 226.383 |
| 0.7875 | 228.852 |
| 0.7881944444444445 | 228.852 |
| 0.7888888888888889 | 234.99 |
| 0.7895833333333333 | 259.104 |
| 0.7902777777777777 | 268.576 |
| 0.7909722222222223 | 259.104 |
| 0.7916666666666666 | 248.335 |
| 0.7923611111111111 | 237.433 |
| 0.7930555555555556 | 226.383 |
| 0.7937500000000001 | 223.906 |
| 0.7944444444444444 | 220.177 |
| 0.7951388888888888 | 212.664 |
| 0.7958333333333334 | 206.348 |
| 0.7965277777777778 | 199.98 |
| 0.7972222222222222 | 193.561 |
| 0.7979166666666666 | 181.877 |
| 0.7986111111111112 | 170.029 |
| 0.7993055555555556 | 158.022 |
| 0.7999999999999999 | 147.223 |
| 0.8006944444444444 | 137.683 |
| 0.8013888888888889 | 129.444 |
| 0.8020833333333334 | 121.152 |
| 0.8027777777777777 | 111.42 |
| 0.8034722222222223 | 100.233 |
| 0.8041666666666667 | 91.806 |
| 0.8048611111111111 | 83.356 |
| 0.8055555555555555 | 74.892 |
| 0.80625 | 69.246 |
| 0.8069444444444445 | 63.6 |
| 0.8076388888888889 | 59.368 |
| 0.8083333333333332 | 57.958 |
| 0.8090277777777778 | 57.958 |
| 0.8097222222222222 | 56.548 |
| 0.8104166666666667 | 55.139 |
| 0.811111111111111 | 53.73 |
| 0.8118055555555556 | 52.322 |
| 0.8125 | 50.914 |
| 0.8131944444444444 | 49.507 |
| 0.813888888888889 | 48.1 |
| 0.8145833333333333 | 45.29 |
| 0.8152777777777778 | 42.483 |
| 0.8159722222222222 | 39.68 |
| 0.8166666666666668 | 36.881 |
| 0.8173611111111111 | 34.086 |
| 0.8180555555555555 | 31.297 |
| 0.81875 | 28.514 |
| 0.8194444444444445 | 25.736 |
| 0.8201388888888889 | 22.965 |
| 0.8208333333333333 | 20.201 |
| 0.8215277777777777 | 17.444 |
| 0.8222222222222223 | 16.069 |
| 0.8229166666666666 | 14.696 |
| 0.8236111111111111 | 11.956 |
| 0.8243055555555556 | 10.589 |
| 0.8250000000000001 | 9.225 |
| 0.8256944444444444 | 9.225 |
| 0.8263888888888888 | 6.503 |
| 0.8270833333333334 | 5.146 |
| 0.8277777777777778 | 5.146 |
| 0.8284722222222222 | 3.791 |
| 0.8291666666666666 | 2.439 |
| 0.8298611111111112 | 2.439 |
| 0.8305555555555556 | 1.09 |
| 0.8312499999999999 | 1.09 |
| 0.8319444444444444 | 1.09 |
| 0.8326388888888889 | 1.09 |
| 0.8333333333333334 | -0.256 |
| 0.8340277777777777 | -0.256 |
| 0.8347222222222223 | -0.256 |
| 0.8354166666666667 | -0.256 |
| 0.8361111111111111 | -0.256 |
| 0.8368055555555555 | -0.256 |
| 0.8375 | -0.256 |
| 0.8381944444444445 | -0.256 |
| 0.8388888888888889 | -0.256 |
| 0.8395833333333332 | -0.256 |
| 0.8402777777777778 | -0.256 |
| 0.8409722222222222 | -0.256 |
| 0.8416666666666667 | -0.256 |
| 0.842361111111111 | -0.256 |
| 0.8430555555555556 | -0.256 |
| 0.84375 | -0.256 |
| 0.8444444444444444 | -0.256 |
| 0.845138888888889 | -0.256 |
| 0.8458333333333333 | -0.256 |
| 0.8465277777777778 | -0.256 |
| 0.8472222222222222 | -0.256 |
| 0.8479166666666668 | -0.256 |
| 0.8486111111111111 | -0.256 |
| 0.8493055555555555 | -0.256 |
| 0.85 | -0.256 |
| 0.8506944444444445 | -0.256 |
| 0.8513888888888889 | -0.256 |
| 0.8520833333333333 | -0.256 |
| 0.8527777777777777 | -0.256 |
| 0.8534722222222223 | -0.256 |
| 0.8541666666666666 | -0.256 |
| 0.8548611111111111 | -0.256 |
| 0.8555555555555556 | -0.256 |
| 0.8562500000000001 | -0.256 |
| 0.8569444444444444 | -0.256 |
| 0.8576388888888888 | -0.256 |
| 0.8583333333333334 | -0.256 |
| 0.8590277777777778 | -0.256 |
| 0.8597222222222222 | -0.256 |
| 0.8604166666666666 | -0.256 |
| 0.8611111111111112 | -0.256 |
| 0.8618055555555556 | -0.256 |
| 0.8624999999999999 | -0.256 |
| 0.8631944444444444 | -0.256 |
| 0.8638888888888889 | -0.256 |
| 0.8645833333333334 | -0.256 |
| 0.8652777777777777 | -0.256 |
| 0.8659722222222223 | -0.256 |
| 0.8666666666666667 | -0.256 |
| 0.8673611111111111 | -0.256 |
| 0.8680555555555555 | -0.256 |
| 0.86875 | -0.256 |
| 0.8694444444444445 | -0.256 |
| 0.8701388888888889 | -0.256 |
| 0.8708333333333332 | -0.256 |
| 0.8715277777777778 | -0.256 |
| 0.8722222222222222 | -0.256 |
| 0.8729166666666667 | -0.256 |
| 0.873611111111111 | -0.256 |
| 0.8743055555555556 | -0.256 |
| 0.875 | -0.256 |
| 0.8756944444444444 | -0.256 |
| 0.876388888888889 | -0.256 |
| 0.8770833333333333 | -0.256 |
| 0.8777777777777778 | -0.256 |
| 0.8784722222222222 | -0.256 |
| 0.8791666666666668 | -0.256 |
| 0.8798611111111111 | -0.256 |
| 0.8805555555555555 | -0.256 |
| 0.88125 | -0.256 |
| 0.8819444444444445 | -0.256 |
| 0.8826388888888889 | -0.256 |
| 0.8833333333333333 | -0.256 |
| 0.8840277777777777 | -0.256 |
| 0.8847222222222223 | -0.256 |
| 0.8854166666666666 | -0.256 |
| 0.8861111111111111 | -0.256 |
| 0.8868055555555556 | -0.256 |
| 0.8875000000000001 | -0.256 |
| 0.8881944444444444 | -0.256 |
| 0.8888888888888888 | -0.256 |
| 0.8895833333333334 | -0.256 |
| 0.8902777777777778 | -0.256 |
| 0.8909722222222222 | -0.256 |
| 0.8916666666666666 | -0.256 |
| 0.8923611111111112 | -0.256 |
| 0.8930555555555556 | -0.256 |
| 0.8937499999999999 | -0.256 |
| 0.8944444444444444 | -0.256 |
| 0.8951388888888889 | -0.256 |
| 0.8958333333333334 | -0.256 |
| 0.8965277777777777 | -0.256 |
| 0.8972222222222223 | -0.256 |
| 0.8979166666666667 | -0.256 |
| 0.8986111111111111 | -0.256 |
| 0.8993055555555555 | -0.256 |
| 0.9 | -0.256 |
| 0.9006944444444445 | -0.256 |
| 0.9013888888888889 | -0.256 |
| 0.9020833333333332 | -0.256 |
| 0.9027777777777778 | -0.256 |
| 0.9034722222222222 | -0.256 |
| 0.9041666666666667 | -0.256 |
| 0.904861111111111 | -0.256 |
| 0.9055555555555556 | -0.256 |
| 0.90625 | -0.256 |
| 0.9069444444444444 | -0.256 |
| 0.907638888888889 | -0.256 |
| 0.9083333333333333 | -0.256 |
| 0.9090277777777778 | -0.256 |
| 0.9097222222222222 | -0.256 |
| 0.9104166666666668 | -0.256 |
| 0.9111111111111111 | -0.256 |
| 0.9118055555555555 | -0.256 |
| 0.9125 | -0.256 |
| 0.9131944444444445 | -0.256 |
| 0.9138888888888889 | -0.256 |
| 0.9145833333333333 | -0.256 |
| 0.9152777777777777 | -0.256 |
| 0.9159722222222223 | -0.256 |
| 0.9166666666666666 | -0.256 |
| 0.9173611111111111 | -0.256 |
| 0.9180555555555556 | -0.256 |
| 0.9187500000000001 | -0.256 |
| 0.9194444444444444 | -0.256 |
| 0.9201388888888888 | -0.256 |
| 0.9208333333333334 | -0.256 |
| 0.9215277777777778 | -0.256 |
| 0.9222222222222222 | -0.256 |
| 0.9229166666666666 | -0.256 |
| 0.9236111111111112 | -0.256 |
| 0.9243055555555556 | -0.256 |
| 0.9249999999999999 | -0.256 |
| 0.9256944444444444 | -0.256 |
| 0.9263888888888889 | -0.256 |
| 0.9270833333333334 | -0.256 |
| 0.9277777777777777 | -0.256 |
| 0.9284722222222223 | -0.256 |
| 0.9291666666666667 | -0.256 |
| 0.9298611111111111 | -0.256 |
| 0.9305555555555555 | -0.256 |
| 0.93125 | -0.256 |
| 0.9319444444444445 | -0.256 |
| 0.9326388888888889 | -0.256 |
| 0.9333333333333332 | -0.256 |
| 0.9340277777777778 | -0.256 |
| 0.9347222222222222 | -0.256 |
| 0.9354166666666667 | -0.256 |
| 0.936111111111111 | -0.256 |
| 0.9368055555555556 | -0.256 |
| 0.9375 | -0.256 |
| 0.9381944444444444 | -0.256 |
| 0.938888888888889 | -0.256 |
| 0.9395833333333333 | -0.256 |
| 0.9402777777777778 | -0.256 |
| 0.9409722222222222 | -0.256 |
| 0.9416666666666668 | -0.256 |
| 0.9423611111111111 | -0.256 |
| 0.9430555555555555 | -0.256 |
| 0.94375 | -0.256 |
| 0.9444444444444445 | -0.256 |
| 0.9451388888888889 | -0.256 |
| 0.9458333333333333 | -0.256 |
| 0.9465277777777777 | -0.256 |
| 0.9472222222222223 | -0.256 |
| 0.9479166666666666 | -0.256 |
| 0.9486111111111111 | -0.256 |
| 0.9493055555555556 | -0.256 |
| 0.9500000000000001 | -0.256 |
| 0.9506944444444444 | -0.256 |
| 0.9513888888888888 | -0.256 |
| 0.9520833333333334 | -0.256 |
| 0.9527777777777778 | -0.256 |
| 0.9534722222222222 | -0.256 |
| 0.9541666666666666 | -0.256 |
| 0.9548611111111112 | -0.256 |
| 0.9555555555555556 | -0.256 |
| 0.9562499999999999 | -0.256 |
| 0.9569444444444444 | -0.256 |
| 0.9576388888888889 | -0.256 |
| 0.9583333333333334 | -0.256 |
| 0.9590277777777777 | -0.256 |
| 0.9597222222222223 | -0.256 |
| 0.9604166666666667 | -0.256 |
| 0.9611111111111111 | -0.256 |
| 0.9618055555555555 | -0.256 |
| 0.9625 | -0.256 |
| 0.9631944444444445 | -0.256 |
| 0.9638888888888889 | -0.256 |
| 0.9645833333333332 | -0.256 |
| 0.9652777777777778 | -0.256 |
| 0.9659722222222222 | -0.256 |
| 0.9666666666666667 | -0.256 |
| 0.967361111111111 | -0.256 |
| 0.9680555555555556 | -0.256 |
| 0.96875 | -0.256 |
| 0.9694444444444444 | -0.256 |
| 0.970138888888889 | -0.256 |
| 0.9708333333333333 | -0.256 |
| 0.9715277777777778 | -0.256 |
| 0.9722222222222222 | -0.256 |
| 0.9729166666666668 | -0.256 |
| 0.9736111111111111 | -0.256 |
| 0.9743055555555555 | -0.256 |
| 0.975 | -0.256 |
| 0.9756944444444445 | -0.256 |
| 0.9763888888888889 | -0.256 |
| 0.9770833333333333 | -0.256 |
| 0.9777777777777777 | -0.256 |
| 0.9784722222222223 | -0.256 |
| 0.9791666666666666 | -0.256 |
| 0.9798611111111111 | -0.256 |
| 0.9805555555555556 | -0.256 |
| 0.9812500000000001 | -0.256 |
| 0.9819444444444444 | -0.256 |
| 0.9826388888888888 | -0.256 |
| 0.9833333333333334 | -0.256 |
| 0.9840277777777778 | -0.256 |
| 0.9847222222222222 | -0.256 |
| 0.9854166666666666 | -0.256 |
| 0.9861111111111112 | -0.256 |
| 0.9868055555555556 | -0.256 |
| 0.9874999999999999 | -0.256 |
| 0.9881944444444444 | -0.256 |
| 0.9888888888888889 | -0.256 |
| 0.9895833333333334 | -0.256 |
| 0.9902777777777777 | -0.256 |
| 0.9909722222222223 | -0.256 |
| 0.9916666666666667 | -0.256 |
| 0.9923611111111111 | -0.256 |
| 0.9930555555555555 | -0.256 |
| 0.99375 | -0.256 |
| 0.9944444444444445 | -0.256 |
| 0.9951388888888889 | -0.256 |
| 0.9958333333333332 | -0.256 |
| 0.9965277777777778 | -0.256 |
| 0.9972222222222222 | -0.256 |
| 0.9979166666666667 | -0.256 |
| 0.998611111111111 | -0.256 |
| 0.9993055555555556 | 0 |